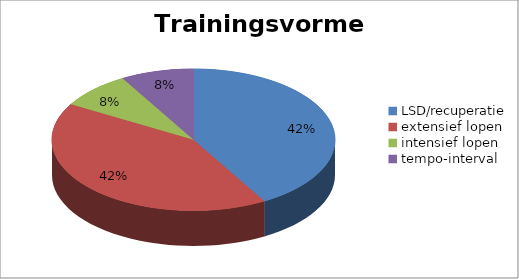
| Category | Series 0 |
|---|---|
| LSD/recuperatie | 150 |
| extensief lopen | 150 |
| intensief lopen | 30 |
| tempo-interval | 30 |